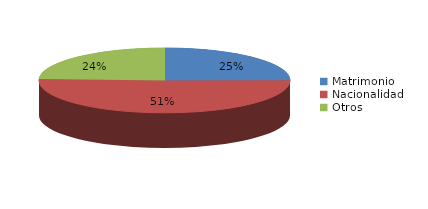
| Category | Series 0 |
|---|---|
| Matrimonio | 1716 |
| Nacionalidad | 3506 |
| Otros | 1681 |